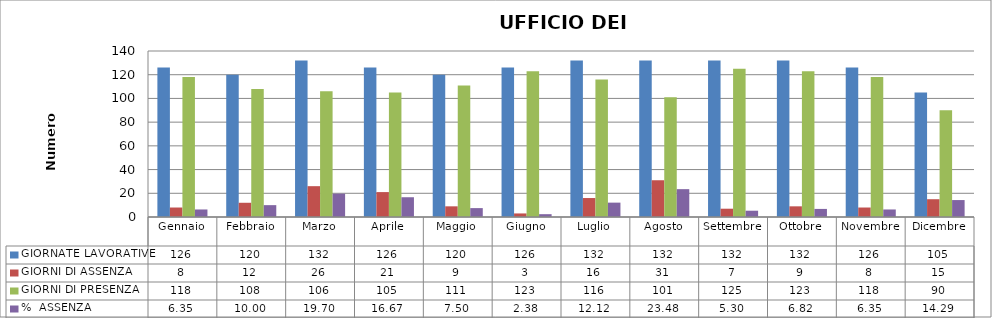
| Category | GIORNATE LAVORATIVE | GIORNI DI ASSENZA | GIORNI DI PRESENZA | %  ASSENZA |
|---|---|---|---|---|
| Gennaio | 126 | 8 | 118 | 6.349 |
| Febbraio | 120 | 12 | 108 | 10 |
| Marzo | 132 | 26 | 106 | 19.697 |
| Aprile | 126 | 21 | 105 | 16.667 |
| Maggio | 120 | 9 | 111 | 7.5 |
| Giugno | 126 | 3 | 123 | 2.381 |
| Luglio | 132 | 16 | 116 | 12.121 |
| Agosto | 132 | 31 | 101 | 23.485 |
| Settembre | 132 | 7 | 125 | 5.303 |
| Ottobre | 132 | 9 | 123 | 6.818 |
| Novembre | 126 | 8 | 118 | 6.349 |
| Dicembre | 105 | 15 | 90 | 14.286 |